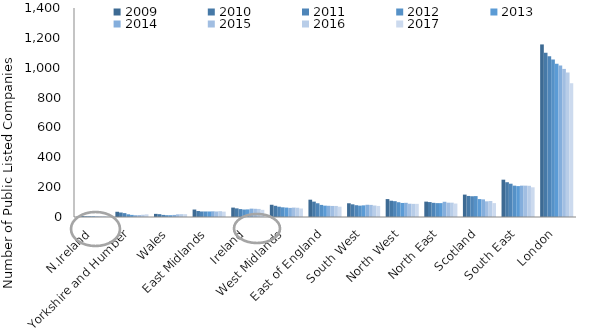
| Category | 2009 | 2010 | 2011 | 2012 | 2013 | 2014 | 2015 | 2016 | 2017 |
|---|---|---|---|---|---|---|---|---|---|
| N.Ireland | 6 | 6 | 5 | 5 | 5 | 4 | 4 | 5 | 4 |
| Yorkshire and Humber | 35 | 30 | 26 | 18 | 14 | 12 | 13 | 15 | 18 |
| Wales | 21 | 19 | 14 | 12 | 12 | 14 | 18 | 19 | 19 |
| East Midlands | 50 | 40 | 37 | 37 | 37 | 38 | 37 | 39 | 36 |
| Ireland | 63 | 58 | 53 | 50 | 51 | 56 | 55 | 54 | 48 |
| West Midlands | 82 | 75 | 69 | 65 | 63 | 61 | 63 | 62 | 57 |
| East of England | 116 | 103 | 92 | 81 | 76 | 75 | 74 | 74 | 69 |
| South West | 92 | 85 | 79 | 76 | 78 | 82 | 81 | 77 | 74 |
| North West | 120 | 109 | 106 | 99 | 94 | 95 | 89 | 88 | 88 |
| North East | 103 | 100 | 95 | 93 | 93 | 102 | 96 | 96 | 90 |
| Scotland | 150 | 141 | 139 | 140 | 120 | 118 | 105 | 107 | 93 |
| South East | 250 | 233 | 223 | 210 | 207 | 210 | 210 | 209 | 199 |
| London | 1156 | 1101 | 1077 | 1055 | 1027 | 1015 | 992 | 968 | 896 |